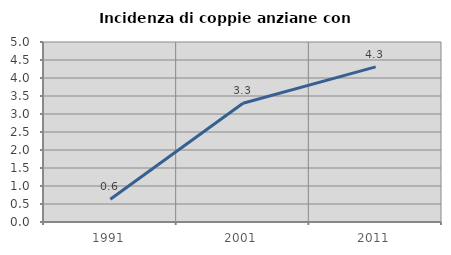
| Category | Incidenza di coppie anziane con figli |
|---|---|
| 1991.0 | 0.631 |
| 2001.0 | 3.297 |
| 2011.0 | 4.31 |